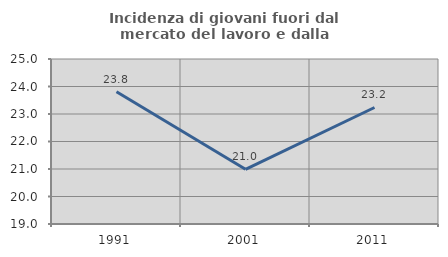
| Category | Incidenza di giovani fuori dal mercato del lavoro e dalla formazione  |
|---|---|
| 1991.0 | 23.81 |
| 2001.0 | 20.988 |
| 2011.0 | 23.237 |